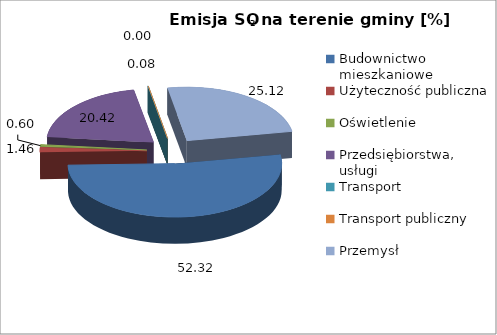
| Category | Budownictwo mieszkaniowe Użyteczność publiczna Oświetlenie Przedsiębiorstwa, usługi Transport Transport publiczny Przemysł |
|---|---|
| Budownictwo mieszkaniowe | 52.316 |
| Użyteczność publiczna | 1.456 |
| Oświetlenie | 0.602 |
| Przedsiębiorstwa, usługi | 20.421 |
| Transport | 0.085 |
| Transport publiczny | 0 |
| Przemysł | 25.12 |